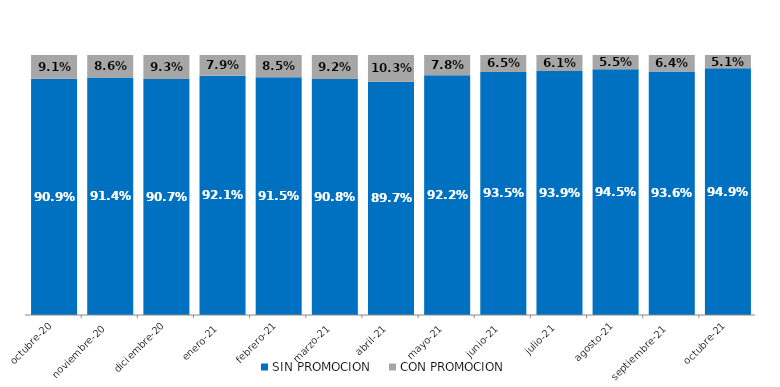
| Category | SIN PROMOCION   | CON PROMOCION   |
|---|---|---|
| 2020-10-01 | 0.909 | 0.091 |
| 2020-11-01 | 0.914 | 0.086 |
| 2020-12-01 | 0.907 | 0.093 |
| 2021-01-01 | 0.921 | 0.079 |
| 2021-02-01 | 0.915 | 0.085 |
| 2021-03-01 | 0.908 | 0.092 |
| 2021-04-01 | 0.897 | 0.103 |
| 2021-05-01 | 0.922 | 0.078 |
| 2021-06-01 | 0.935 | 0.065 |
| 2021-07-01 | 0.939 | 0.061 |
| 2021-08-01 | 0.945 | 0.055 |
| 2021-09-01 | 0.936 | 0.064 |
| 2021-10-01 | 0.949 | 0.051 |